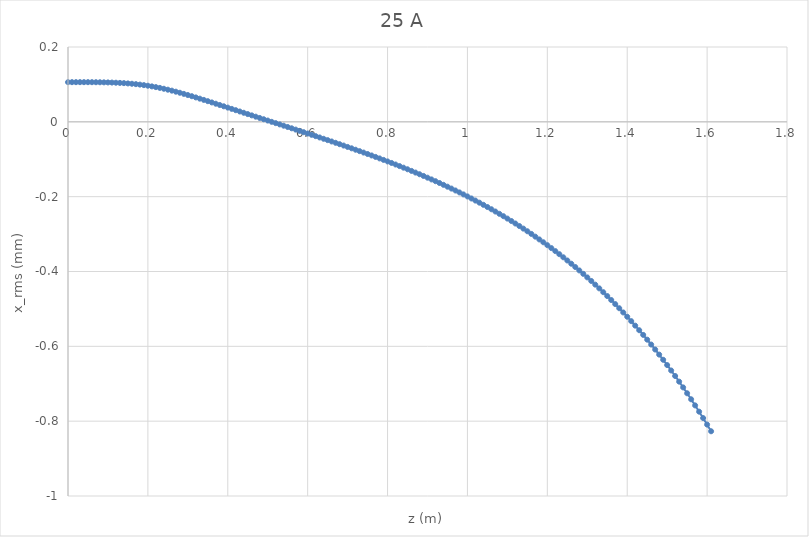
| Category | Series 0 |
|---|---|
| 0.0 | 0.106 |
| 0.01 | 0.106 |
| 0.02 | 0.106 |
| 0.03 | 0.106 |
| 0.04 | 0.106 |
| 0.05 | 0.106 |
| 0.06 | 0.106 |
| 0.07 | 0.106 |
| 0.08 | 0.106 |
| 0.09 | 0.106 |
| 0.1 | 0.105 |
| 0.11 | 0.105 |
| 0.12 | 0.105 |
| 0.13 | 0.104 |
| 0.14 | 0.103 |
| 0.15 | 0.103 |
| 0.16 | 0.102 |
| 0.17 | 0.101 |
| 0.18 | 0.099 |
| 0.19 | 0.098 |
| 0.2 | 0.096 |
| 0.21 | 0.095 |
| 0.22 | 0.093 |
| 0.23 | 0.091 |
| 0.24 | 0.088 |
| 0.25 | 0.086 |
| 0.26 | 0.083 |
| 0.27 | 0.081 |
| 0.28 | 0.078 |
| 0.29 | 0.075 |
| 0.3 | 0.072 |
| 0.31 | 0.068 |
| 0.32 | 0.065 |
| 0.33 | 0.062 |
| 0.34 | 0.059 |
| 0.35 | 0.055 |
| 0.36 | 0.052 |
| 0.37 | 0.048 |
| 0.38 | 0.045 |
| 0.39 | 0.042 |
| 0.4 | 0.038 |
| 0.41 | 0.035 |
| 0.42 | 0.031 |
| 0.43 | 0.028 |
| 0.44 | 0.024 |
| 0.45 | 0.021 |
| 0.46 | 0.017 |
| 0.47 | 0.014 |
| 0.48 | 0.01 |
| 0.49 | 0.007 |
| 0.5 | 0.003 |
| 0.51 | 0 |
| 0.52 | -0.003 |
| 0.53 | -0.007 |
| 0.54 | -0.01 |
| 0.55 | -0.014 |
| 0.56 | -0.017 |
| 0.57 | -0.021 |
| 0.58 | -0.024 |
| 0.59 | -0.028 |
| 0.6 | -0.031 |
| 0.61 | -0.035 |
| 0.62 | -0.038 |
| 0.63 | -0.042 |
| 0.64 | -0.045 |
| 0.65 | -0.049 |
| 0.66 | -0.052 |
| 0.67 | -0.056 |
| 0.68 | -0.06 |
| 0.69 | -0.063 |
| 0.7 | -0.067 |
| 0.71 | -0.071 |
| 0.72 | -0.075 |
| 0.73 | -0.078 |
| 0.74 | -0.082 |
| 0.75 | -0.086 |
| 0.76 | -0.09 |
| 0.77 | -0.094 |
| 0.78 | -0.098 |
| 0.79 | -0.102 |
| 0.8 | -0.106 |
| 0.81 | -0.11 |
| 0.82 | -0.114 |
| 0.83 | -0.118 |
| 0.84 | -0.123 |
| 0.85 | -0.127 |
| 0.86 | -0.131 |
| 0.87 | -0.136 |
| 0.88 | -0.14 |
| 0.89 | -0.145 |
| 0.9 | -0.149 |
| 0.91 | -0.154 |
| 0.92 | -0.159 |
| 0.93 | -0.163 |
| 0.94 | -0.168 |
| 0.95 | -0.173 |
| 0.96 | -0.178 |
| 0.97 | -0.183 |
| 0.98 | -0.189 |
| 0.99 | -0.194 |
| 1.0 | -0.199 |
| 1.01 | -0.205 |
| 1.02 | -0.21 |
| 1.03 | -0.216 |
| 1.04 | -0.222 |
| 1.05 | -0.228 |
| 1.06 | -0.234 |
| 1.07 | -0.24 |
| 1.08 | -0.246 |
| 1.09 | -0.252 |
| 1.1 | -0.259 |
| 1.11 | -0.265 |
| 1.12 | -0.272 |
| 1.13 | -0.279 |
| 1.14 | -0.285 |
| 1.15 | -0.292 |
| 1.16 | -0.3 |
| 1.17 | -0.307 |
| 1.18 | -0.314 |
| 1.19 | -0.322 |
| 1.2 | -0.33 |
| 1.21 | -0.337 |
| 1.22 | -0.346 |
| 1.23 | -0.354 |
| 1.24 | -0.362 |
| 1.25 | -0.371 |
| 1.26 | -0.379 |
| 1.27 | -0.388 |
| 1.28 | -0.397 |
| 1.29 | -0.406 |
| 1.3 | -0.416 |
| 1.31 | -0.425 |
| 1.32 | -0.435 |
| 1.33 | -0.445 |
| 1.34 | -0.455 |
| 1.35 | -0.466 |
| 1.36 | -0.476 |
| 1.37 | -0.487 |
| 1.38 | -0.498 |
| 1.39 | -0.509 |
| 1.4 | -0.521 |
| 1.41 | -0.533 |
| 1.42 | -0.545 |
| 1.43 | -0.557 |
| 1.44 | -0.569 |
| 1.45 | -0.582 |
| 1.46 | -0.595 |
| 1.47 | -0.609 |
| 1.48 | -0.622 |
| 1.49 | -0.636 |
| 1.5 | -0.65 |
| 1.51 | -0.665 |
| 1.52 | -0.679 |
| 1.53 | -0.694 |
| 1.54 | -0.71 |
| 1.55 | -0.725 |
| 1.56 | -0.742 |
| 1.57 | -0.758 |
| 1.58 | -0.775 |
| 1.59 | -0.792 |
| 1.6 | -0.809 |
| 1.61 | -0.827 |